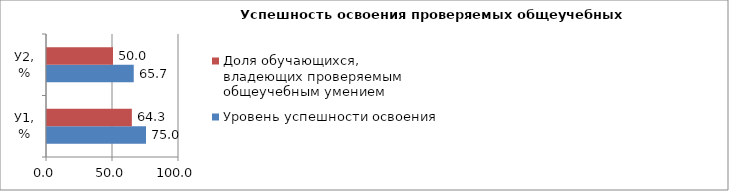
| Category | Уровень успешности освоения | Доля обучающихся, владеющих проверяемым общеучебным умением  |
|---|---|---|
| У1, % | 75 | 64.286 |
| У2, % | 65.714 | 50 |